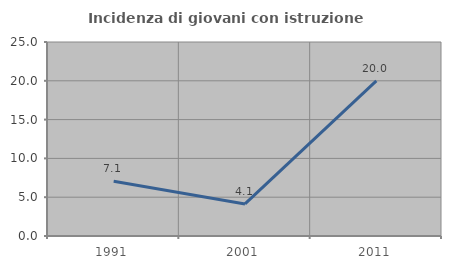
| Category | Incidenza di giovani con istruzione universitaria |
|---|---|
| 1991.0 | 7.059 |
| 2001.0 | 4.132 |
| 2011.0 | 20 |